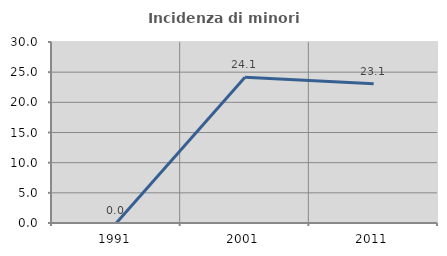
| Category | Incidenza di minori stranieri |
|---|---|
| 1991.0 | 0 |
| 2001.0 | 24.138 |
| 2011.0 | 23.077 |